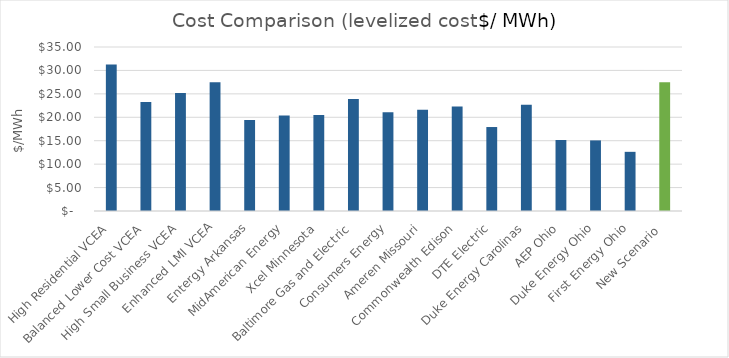
| Category | Levelized cost ($/MWh) in 2025 |
|---|---|
| High Residential VCEA | 31.286 |
| Balanced Lower Cost VCEA | 23.236 |
| High Small Business VCEA | 25.162 |
| Enhanced LMI VCEA | 27.455 |
| Entergy Arkansas | 19.402 |
| MidAmerican Energy | 20.381 |
| Xcel Minnesota | 20.465 |
| Baltimore Gas and Electric | 23.892 |
| Consumers Energy | 21.085 |
| Ameren Missouri | 21.615 |
| Commonwealth Edison | 22.314 |
| DTE Electric | 17.921 |
| Duke Energy Carolinas | 22.694 |
| AEP Ohio | 15.157 |
| Duke Energy Ohio | 15.067 |
| First Energy Ohio | 12.627 |
| New Scenario  | 27.455 |